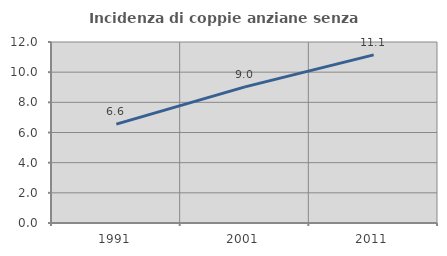
| Category | Incidenza di coppie anziane senza figli  |
|---|---|
| 1991.0 | 6.557 |
| 2001.0 | 9.025 |
| 2011.0 | 11.146 |